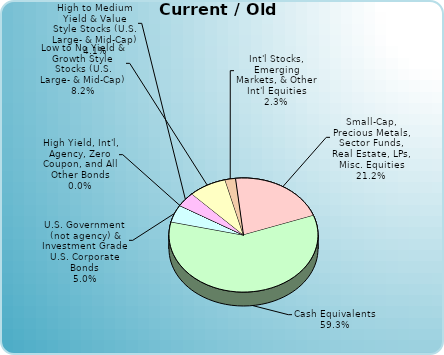
| Category | Series 0 |
|---|---|
| Cash Equivalents | 0.593 |
| U.S. Government (not agency) & Investment Grade U.S. Corporate Bonds | 0.05 |
| Municipal (federally tax-free) Bonds | 0 |
| High Yield, Int'l, Agency, Zero Coupon, and All Other Bonds | 0 |
| High to Medium Yield & Value Style Stocks (U.S. Large- & Mid-Cap) | 0.041 |
| Low to No Yield & Growth Style Stocks (U.S. Large- & Mid-Cap) | 0.082 |
| Int'l Stocks, Emerging Markets, & Other Int'l Equities | 0.023 |
| Small-Cap, Precious Metals, Sector Funds, Real Estate, LPs, Misc. Equities | 0.212 |